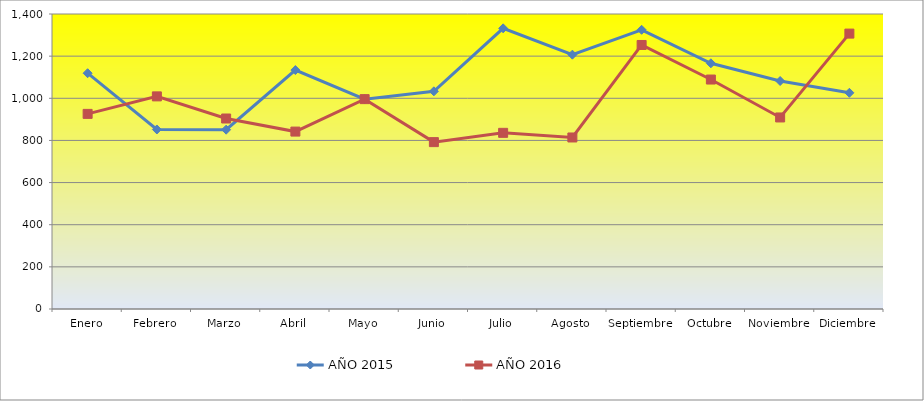
| Category | AÑO 2015 | AÑO 2016 |
|---|---|---|
| Enero | 1119 | 926 |
| Febrero | 852 | 1009 |
| Marzo | 851 | 904 |
| Abril | 1134 | 842 |
| Mayo | 996 | 996 |
| Junio | 1033 | 792 |
| Julio | 1332 | 836 |
| Agosto | 1207 | 814 |
| Septiembre | 1325 | 1253 |
| Octubre | 1166 | 1089 |
| Noviembre | 1082 | 909 |
| Diciembre | 1026 | 1307 |